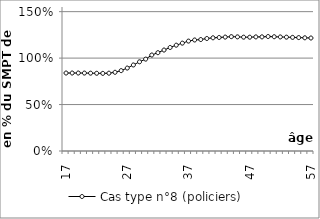
| Category | Cas type n°8 (policiers) |
|---|---|
| 17.0 | 0.839 |
| 18.0 | 0.839 |
| 19.0 | 0.839 |
| 20.0 | 0.839 |
| 21.0 | 0.838 |
| 22.0 | 0.837 |
| 23.0 | 0.836 |
| 24.0 | 0.837 |
| 25.0 | 0.847 |
| 26.0 | 0.865 |
| 27.0 | 0.893 |
| 28.0 | 0.926 |
| 29.0 | 0.96 |
| 30.0 | 0.989 |
| 31.0 | 1.033 |
| 32.0 | 1.058 |
| 33.0 | 1.087 |
| 34.0 | 1.114 |
| 35.0 | 1.139 |
| 36.0 | 1.161 |
| 37.0 | 1.183 |
| 38.0 | 1.195 |
| 39.0 | 1.2 |
| 40.0 | 1.211 |
| 41.0 | 1.219 |
| 42.0 | 1.222 |
| 43.0 | 1.226 |
| 44.0 | 1.231 |
| 45.0 | 1.228 |
| 46.0 | 1.225 |
| 47.0 | 1.225 |
| 48.0 | 1.228 |
| 49.0 | 1.229 |
| 50.0 | 1.232 |
| 51.0 | 1.23 |
| 52.0 | 1.228 |
| 53.0 | 1.225 |
| 54.0 | 1.223 |
| 55.0 | 1.221 |
| 56.0 | 1.219 |
| 57.0 | 1.216 |